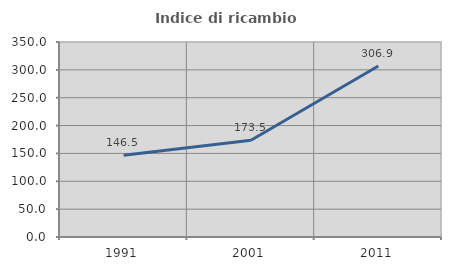
| Category | Indice di ricambio occupazionale  |
|---|---|
| 1991.0 | 146.546 |
| 2001.0 | 173.529 |
| 2011.0 | 306.941 |